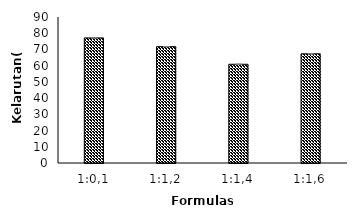
| Category | Kelarutan (%) |
|---|---|
| 1:0,1 | 77.12 |
| 1:1,2 | 71.72 |
| 1:1,4 | 60.86 |
| 1:1,6 | 67.3 |